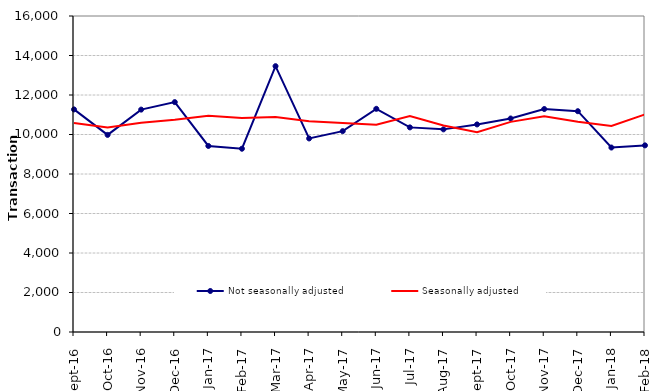
| Category | Not seasonally adjusted | Seasonally adjusted |
|---|---|---|
| 2016-09-01 | 11270 | 10580 |
| 2016-10-01 | 9980 | 10360 |
| 2016-11-01 | 11260 | 10590 |
| 2016-12-01 | 11640 | 10750 |
| 2017-01-01 | 9420 | 10950 |
| 2017-02-01 | 9280 | 10840 |
| 2017-03-01 | 13460 | 10890 |
| 2017-04-01 | 9800 | 10670 |
| 2017-05-01 | 10170 | 10580 |
| 2017-06-01 | 11300 | 10500 |
| 2017-07-01 | 10360 | 10940 |
| 2017-08-01 | 10260 | 10460 |
| 2017-09-01 | 10510 | 10120 |
| 2017-10-01 | 10810 | 10640 |
| 2017-11-01 | 11290 | 10920 |
| 2017-12-01 | 11180 | 10650 |
| 2018-01-01 | 9340 | 10430 |
| 2018-02-01 | 9450 | 11020 |